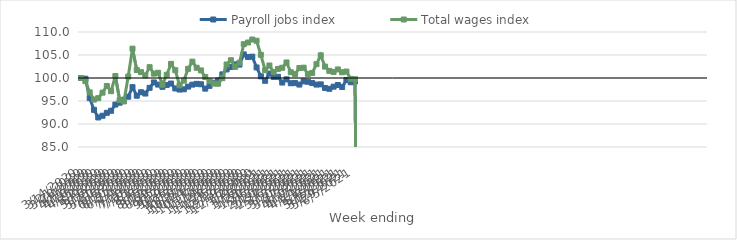
| Category | Payroll jobs index | Total wages index |
|---|---|---|
| 14/03/2020 | 100 | 100 |
| 21/03/2020 | 99.85 | 99.318 |
| 28/03/2020 | 95.631 | 96.862 |
| 04/04/2020 | 93.071 | 95.309 |
| 11/04/2020 | 91.422 | 95.612 |
| 18/04/2020 | 91.794 | 96.818 |
| 25/04/2020 | 92.431 | 98.27 |
| 02/05/2020 | 92.872 | 97.137 |
| 09/05/2020 | 94.228 | 100.426 |
| 16/05/2020 | 94.63 | 95.217 |
| 23/05/2020 | 95.284 | 94.91 |
| 30/05/2020 | 95.931 | 100.313 |
| 06/06/2020 | 98.004 | 106.378 |
| 13/06/2020 | 96.148 | 101.726 |
| 20/06/2020 | 96.902 | 101.271 |
| 27/06/2020 | 96.623 | 100.563 |
| 04/07/2020 | 97.865 | 102.351 |
| 11/07/2020 | 99.033 | 100.951 |
| 18/07/2020 | 98.563 | 101.137 |
| 25/07/2020 | 98.079 | 98.557 |
| 01/08/2020 | 98.493 | 100.688 |
| 08/08/2020 | 98.796 | 103.064 |
| 15/08/2020 | 97.726 | 101.696 |
| 22/08/2020 | 97.492 | 98.425 |
| 29/08/2020 | 97.539 | 99.427 |
| 05/09/2020 | 98.128 | 101.991 |
| 12/09/2020 | 98.561 | 103.551 |
| 19/09/2020 | 98.733 | 102.225 |
| 26/09/2020 | 98.639 | 101.649 |
| 03/10/2020 | 97.688 | 100.221 |
| 10/10/2020 | 98.292 | 99.31 |
| 17/10/2020 | 98.968 | 98.785 |
| 24/10/2020 | 99.447 | 98.762 |
| 31/10/2020 | 100.786 | 99.957 |
| 07/11/2020 | 101.861 | 102.934 |
| 14/11/2020 | 102.378 | 103.868 |
| 21/11/2020 | 102.964 | 102.422 |
| 28/11/2020 | 102.917 | 103.317 |
| 05/12/2020 | 105.131 | 107.351 |
| 12/12/2020 | 104.57 | 107.718 |
| 19/12/2020 | 104.638 | 108.365 |
| 26/12/2020 | 102.29 | 108.102 |
| 02/01/2021 | 100.362 | 105.043 |
| 09/01/2021 | 99.392 | 101.692 |
| 16/01/2021 | 100.97 | 102.716 |
| 23/01/2021 | 100.236 | 101.248 |
| 30/01/2021 | 100.262 | 101.979 |
| 06/02/2021 | 99.01 | 102.23 |
| 13/02/2021 | 99.706 | 103.376 |
| 20/02/2021 | 98.86 | 101.256 |
| 27/02/2021 | 98.894 | 100.846 |
| 06/03/2021 | 98.572 | 102.17 |
| 13/03/2021 | 99.266 | 102.24 |
| 20/03/2021 | 99.179 | 100.853 |
| 27/03/2021 | 98.905 | 101.098 |
| 03/04/2021 | 98.57 | 103.008 |
| 10/04/2021 | 98.616 | 104.932 |
| 17/04/2021 | 97.824 | 102.479 |
| 24/04/2021 | 97.651 | 101.555 |
| 01/05/2021 | 98.116 | 101.316 |
| 08/05/2021 | 98.48 | 101.863 |
| 15/05/2021 | 98.04 | 101.248 |
| 22/05/2021 | 99.556 | 101.398 |
| 29/05/2021 | 99.074 | 99.811 |
| 05/06/2021 | 99.281 | 99.745 |